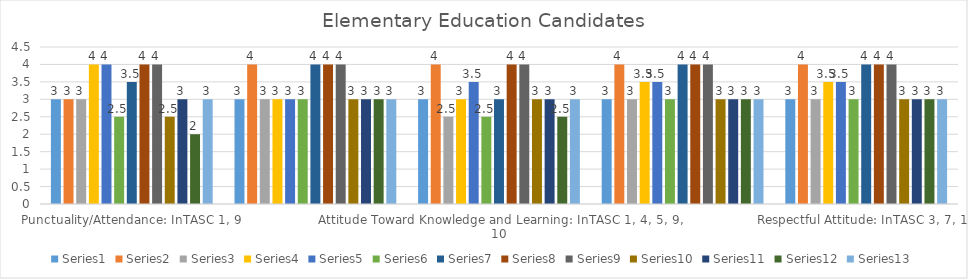
| Category | Series 0 | Series 1 | Series 2 | Series 3 | Series 4 | Series 5 | Series 6 | Series 7 | Series 8 | Series 9 | Series 10 | Series 11 | Series 12 |
|---|---|---|---|---|---|---|---|---|---|---|---|---|---|
| Punctuality/Attendance: InTASC 1, 9 | 3 | 3 | 3 | 4 | 4 | 2.5 | 3.5 | 4 | 4 | 2.5 | 3 | 2 | 3 |
| Interactions with Others: InTASC 3, 7, 10 | 3 | 4 | 3 | 3 | 3 | 3 | 4 | 4 | 4 | 3 | 3 | 3 | 3 |
| Attitude Toward Knowledge and Learning: InTASC 1, 4, 5, 9, 10 | 3 | 4 | 2.5 | 3 | 3.5 | 2.5 | 3 | 4 | 4 | 3 | 3 | 2.5 | 3 |
| Patience: InTASC 3, 10 | 3 | 4 | 3 | 3.5 | 3.5 | 3 | 4 | 4 | 4 | 3 | 3 | 3 | 3 |
| Respectful Attitude: InTASC 3, 7, 10 | 3 | 4 | 3 | 3.5 | 3.5 | 3 | 4 | 4 | 4 | 3 | 3 | 3 | 3 |